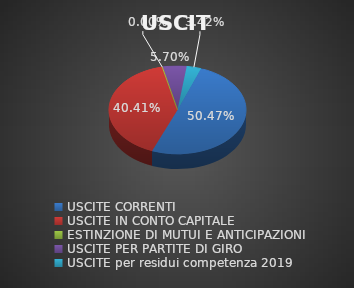
| Category | USCITE |
|---|---|
| USCITE CORRENTI | 0.505 |
| USCITE IN CONTO CAPITALE | 0.404 |
| ESTINZIONE DI MUTUI E ANTICIPAZIONI | 0 |
| USCITE PER PARTITE DI GIRO | 0.057 |
| USCITE per residui competenza 2019 | 0.034 |